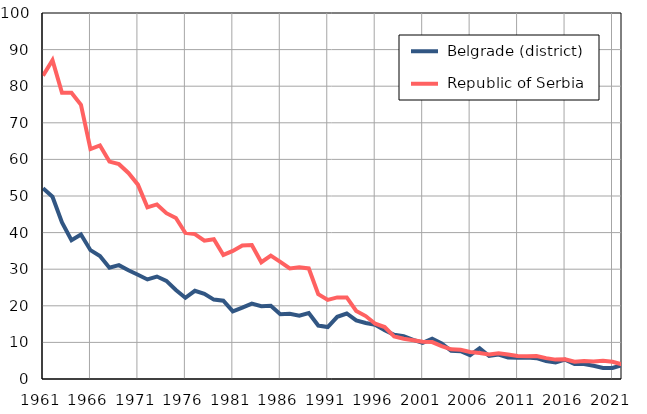
| Category |  Belgrade (district) |  Republic of Serbia |
|---|---|---|
| 1961.0 | 52.1 | 82.9 |
| 1962.0 | 49.8 | 87.1 |
| 1963.0 | 42.8 | 78.2 |
| 1964.0 | 37.9 | 78.2 |
| 1965.0 | 39.5 | 74.9 |
| 1966.0 | 35.2 | 62.8 |
| 1967.0 | 33.6 | 63.8 |
| 1968.0 | 30.4 | 59.4 |
| 1969.0 | 31.1 | 58.7 |
| 1970.0 | 29.7 | 56.3 |
| 1971.0 | 28.5 | 53.1 |
| 1972.0 | 27.2 | 46.9 |
| 1973.0 | 28 | 47.7 |
| 1974.0 | 26.8 | 45.3 |
| 1975.0 | 24.3 | 44 |
| 1976.0 | 22.2 | 39.9 |
| 1977.0 | 24.1 | 39.6 |
| 1978.0 | 23.3 | 37.8 |
| 1979.0 | 21.7 | 38.2 |
| 1980.0 | 21.4 | 33.9 |
| 1981.0 | 18.5 | 35 |
| 1982.0 | 19.5 | 36.5 |
| 1983.0 | 20.6 | 36.6 |
| 1984.0 | 19.9 | 31.9 |
| 1985.0 | 20 | 33.7 |
| 1986.0 | 17.7 | 32 |
| 1987.0 | 17.8 | 30.2 |
| 1988.0 | 17.3 | 30.5 |
| 1989.0 | 18 | 30.2 |
| 1990.0 | 14.6 | 23.2 |
| 1991.0 | 14.2 | 21.6 |
| 1992.0 | 17 | 22.3 |
| 1993.0 | 17.9 | 22.3 |
| 1994.0 | 16 | 18.6 |
| 1995.0 | 15.3 | 17.2 |
| 1996.0 | 14.8 | 15.1 |
| 1997.0 | 13.3 | 14.2 |
| 1998.0 | 12.1 | 11.6 |
| 1999.0 | 11.7 | 11 |
| 2000.0 | 10.7 | 10.6 |
| 2001.0 | 9.9 | 10.2 |
| 2002.0 | 11 | 10.1 |
| 2003.0 | 9.7 | 9 |
| 2004.0 | 7.7 | 8.1 |
| 2005.0 | 7.6 | 8 |
| 2006.0 | 6.5 | 7.4 |
| 2007.0 | 8.4 | 7.1 |
| 2008.0 | 6.3 | 6.7 |
| 2009.0 | 6.7 | 7 |
| 2010.0 | 5.9 | 6.7 |
| 2011.0 | 5.8 | 6.3 |
| 2012.0 | 5.9 | 6.2 |
| 2013.0 | 5.7 | 6.3 |
| 2014.0 | 4.9 | 5.7 |
| 2015.0 | 4.5 | 5.3 |
| 2016.0 | 5.3 | 5.4 |
| 2017.0 | 4.1 | 4.7 |
| 2018.0 | 4.1 | 4.9 |
| 2019.0 | 3.6 | 4.8 |
| 2020.0 | 3 | 5 |
| 2021.0 | 3 | 4.7 |
| 2022.0 | 3.8 | 4 |